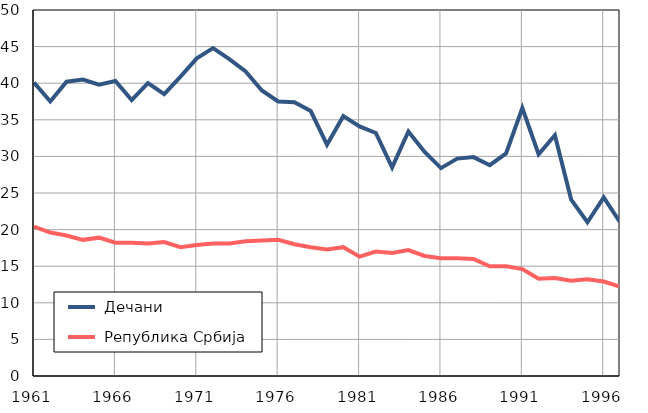
| Category |  Дечани |  Република Србија |
|---|---|---|
| 1961.0 | 40.1 | 20.4 |
| 1962.0 | 37.5 | 19.6 |
| 1963.0 | 40.2 | 19.2 |
| 1964.0 | 40.5 | 18.6 |
| 1965.0 | 39.8 | 18.9 |
| 1966.0 | 40.3 | 18.2 |
| 1967.0 | 37.7 | 18.2 |
| 1968.0 | 40 | 18.1 |
| 1969.0 | 38.5 | 18.3 |
| 1970.0 | 40.9 | 17.6 |
| 1971.0 | 43.4 | 17.9 |
| 1972.0 | 44.8 | 18.1 |
| 1973.0 | 43.3 | 18.1 |
| 1974.0 | 41.6 | 18.4 |
| 1975.0 | 39 | 18.5 |
| 1976.0 | 37.5 | 18.6 |
| 1977.0 | 37.4 | 18 |
| 1978.0 | 36.2 | 17.6 |
| 1979.0 | 31.6 | 17.3 |
| 1980.0 | 35.5 | 17.6 |
| 1981.0 | 34.1 | 16.3 |
| 1982.0 | 33.2 | 17 |
| 1983.0 | 28.5 | 16.8 |
| 1984.0 | 33.4 | 17.2 |
| 1985.0 | 30.6 | 16.4 |
| 1986.0 | 28.4 | 16.1 |
| 1987.0 | 29.7 | 16.1 |
| 1988.0 | 29.9 | 16 |
| 1989.0 | 28.8 | 15 |
| 1990.0 | 30.4 | 15 |
| 1991.0 | 36.6 | 14.6 |
| 1992.0 | 30.3 | 13.3 |
| 1993.0 | 32.9 | 13.4 |
| 1994.0 | 24.1 | 13 |
| 1995.0 | 21 | 13.2 |
| 1996.0 | 24.4 | 12.9 |
| 1997.0 | 21 | 12.2 |